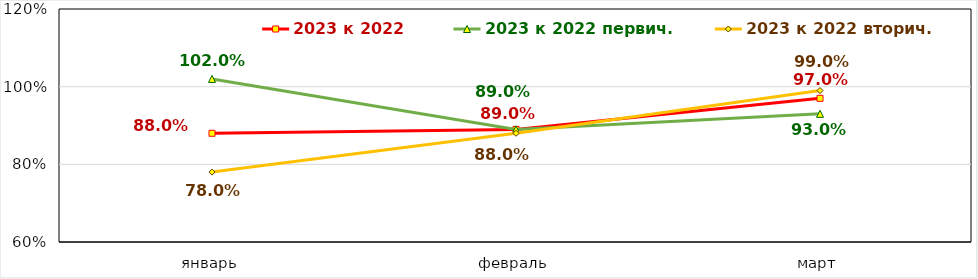
| Category | 2023 к 2022 | 2023 к 2022 первич. | 2023 к 2022 вторич. |
|---|---|---|---|
| январь | 0.88 | 1.02 | 0.78 |
| февраль | 0.89 | 0.89 | 0.88 |
| март | 0.97 | 0.93 | 0.99 |